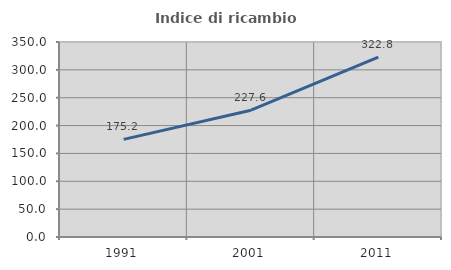
| Category | Indice di ricambio occupazionale  |
|---|---|
| 1991.0 | 175.215 |
| 2001.0 | 227.628 |
| 2011.0 | 322.797 |